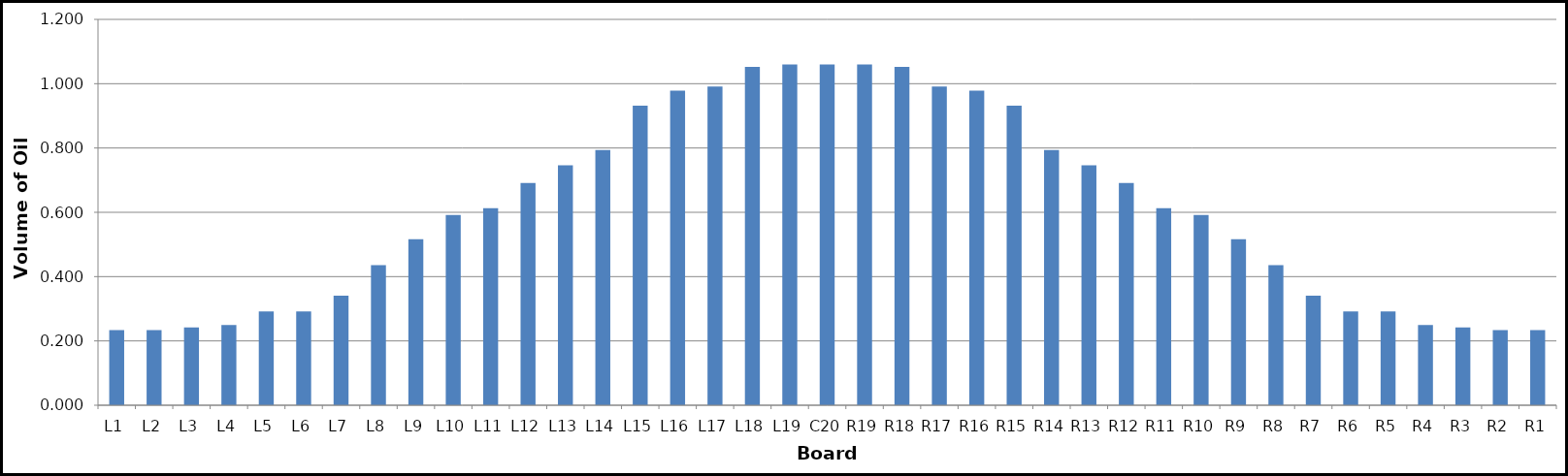
| Category | Series 0 |
|---|---|
| L1 | 0.234 |
| L2 | 0.234 |
| L3 | 0.242 |
| L4 | 0.25 |
| L5 | 0.292 |
| L6 | 0.292 |
| L7 | 0.341 |
| L8 | 0.436 |
| L9 | 0.516 |
| L10 | 0.592 |
| L11 | 0.613 |
| L12 | 0.691 |
| L13 | 0.746 |
| L14 | 0.794 |
| L15 | 0.932 |
| L16 | 0.978 |
| L17 | 0.991 |
| L18 | 1.053 |
| L19 | 1.06 |
| C20 | 1.06 |
| R19 | 1.06 |
| R18 | 1.053 |
| R17 | 0.991 |
| R16 | 0.978 |
| R15 | 0.932 |
| R14 | 0.794 |
| R13 | 0.746 |
| R12 | 0.691 |
| R11 | 0.613 |
| R10 | 0.592 |
| R9 | 0.516 |
| R8 | 0.436 |
| R7 | 0.341 |
| R6 | 0.292 |
| R5 | 0.292 |
| R4 | 0.25 |
| R3 | 0.242 |
| R2 | 0.234 |
| R1 | 0.234 |